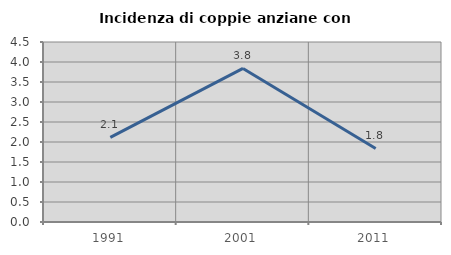
| Category | Incidenza di coppie anziane con figli |
|---|---|
| 1991.0 | 2.116 |
| 2001.0 | 3.84 |
| 2011.0 | 1.839 |